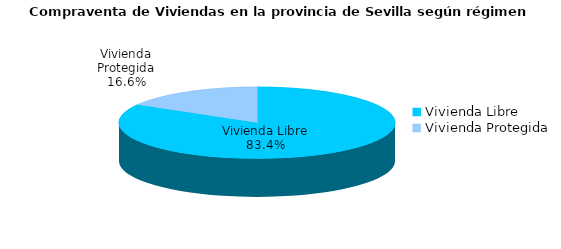
| Category | Series 0 | Series 1 |
|---|---|---|
| Vivienda Libre | 659 | 0.834 |
| Vivienda Protegida | 131 | 0.166 |